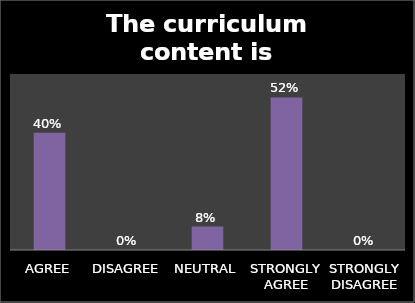
| Category | Series 0 |
|---|---|
| AGREE | 0.4 |
| DISAGREE | 0 |
| NEUTRAL | 0.08 |
| STRONGLY AGREE | 0.52 |
| STRONGLY DISAGREE | 0 |